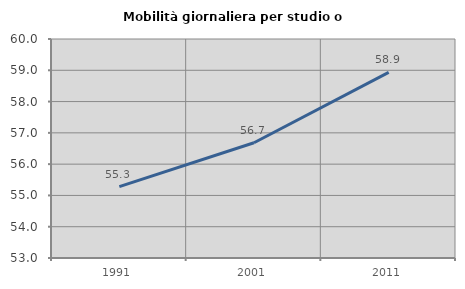
| Category | Mobilità giornaliera per studio o lavoro |
|---|---|
| 1991.0 | 55.282 |
| 2001.0 | 56.684 |
| 2011.0 | 58.931 |